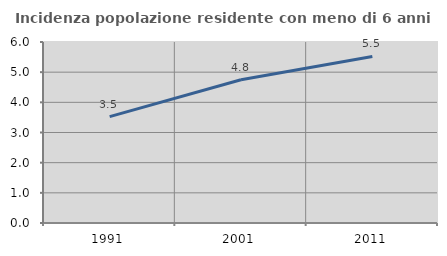
| Category | Incidenza popolazione residente con meno di 6 anni |
|---|---|
| 1991.0 | 3.525 |
| 2001.0 | 4.75 |
| 2011.0 | 5.521 |